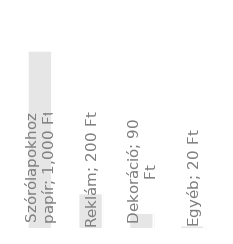
| Category | Éves kiadások |
|---|---|
| Szórólapokhoz papír | 1000 |
| Reklám | 200 |
| Dekoráció | 90 |
| Egyéb | 20 |